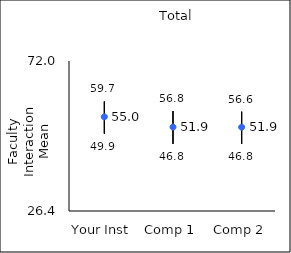
| Category | 25th percentile | 75th percentile | Mean |
|---|---|---|---|
| Your Inst | 49.9 | 59.7 | 55.02 |
| Comp 1 | 46.8 | 56.8 | 51.91 |
| Comp 2 | 46.8 | 56.6 | 51.89 |